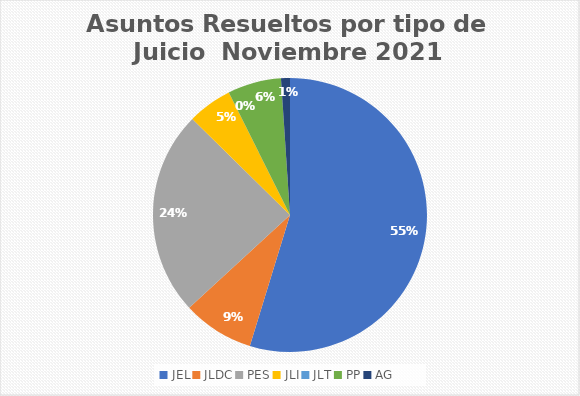
| Category | Asuntos Resueltos por tipo de Juicio  Noviembre |
|---|---|
| JEL | 52 |
| JLDC | 8 |
| PES | 23 |
| JLI | 5 |
| JLT | 0 |
| PP | 6 |
| AG | 1 |